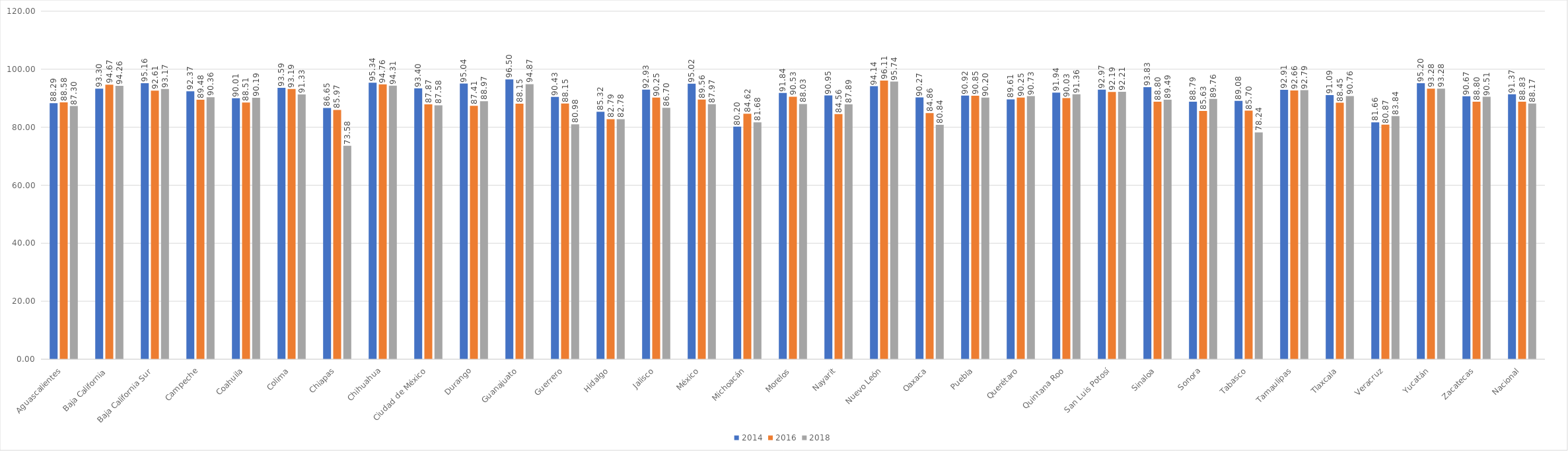
| Category | 2014 | 2016 | 2018 |
|---|---|---|---|
| Aguascalientes | 88.289 | 88.58 | 87.297 |
| Baja California | 93.304 | 94.668 | 94.263 |
| Baja California Sur | 95.161 | 92.608 | 93.172 |
| Campeche | 92.368 | 89.476 | 90.358 |
| Coahuila | 90.008 | 88.514 | 90.187 |
| Colima | 93.595 | 93.189 | 91.327 |
| Chiapas | 86.65 | 85.972 | 73.579 |
| Chihuahua | 95.343 | 94.765 | 94.306 |
| Ciudad de México | 93.399 | 87.875 | 87.58 |
| Durango | 95.044 | 87.407 | 88.969 |
| Guanajuato | 96.5 | 88.147 | 94.866 |
| Guerrero | 90.43 | 88.153 | 80.985 |
| Hidalgo | 85.319 | 82.793 | 82.779 |
| Jalisco | 92.934 | 90.247 | 86.696 |
| México | 95.016 | 89.558 | 87.973 |
| Michoacán | 80.204 | 84.622 | 81.685 |
| Morelos | 91.84 | 90.528 | 88.03 |
| Nayarit | 90.951 | 84.561 | 87.892 |
| Nuevo León | 94.143 | 96.113 | 95.743 |
| Oaxaca | 90.274 | 84.858 | 80.837 |
| Puebla | 90.918 | 90.847 | 90.2 |
| Querétaro | 89.615 | 90.252 | 90.734 |
| Quintana Roo | 91.941 | 90.032 | 91.363 |
| San Luis Potosí | 92.967 | 92.187 | 92.211 |
| Sinaloa | 93.826 | 88.797 | 89.49 |
| Sonora | 88.792 | 85.628 | 89.764 |
| Tabasco | 89.083 | 85.704 | 78.241 |
| Tamaulipas | 92.914 | 92.66 | 92.786 |
| Tlaxcala | 91.094 | 88.447 | 90.756 |
| Veracruz | 81.662 | 80.871 | 83.843 |
| Yucatán | 95.197 | 93.277 | 93.28 |
| Zacatecas | 90.671 | 88.797 | 90.51 |
| Nacional | 91.371 | 88.831 | 88.171 |